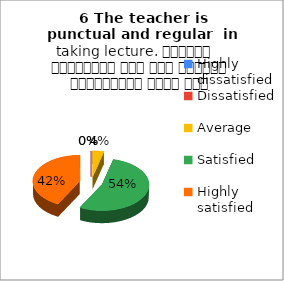
| Category | 6 The teacher is punctual and regular  in taking lecture. शिक्षक समयनिष्ठ हैं एवं नियमित व्याख्यान देते हैं |
|---|---|
| Highly dissatisfied | 0 |
| Dissatisfied | 0 |
| Average | 1 |
| Satisfied | 14 |
| Highly satisfied | 11 |